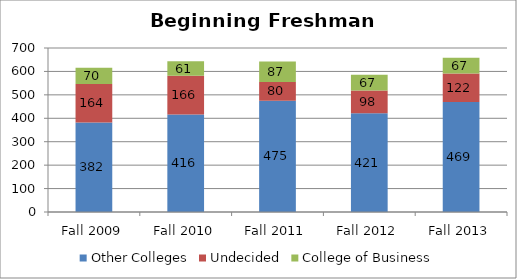
| Category | Other Colleges | Undecided | College of Business |
|---|---|---|---|
| Fall 2009 | 382 | 164 | 70 |
| Fall 2010 | 416 | 166 | 61 |
| Fall 2011 | 475 | 80 | 87 |
| Fall 2012 | 421 | 98 | 67 |
| Fall 2013 | 469 | 122 | 67 |